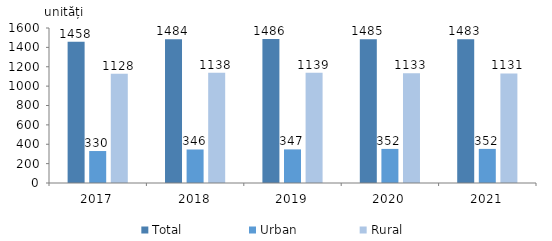
| Category | Total  | Urban | Rural |
|---|---|---|---|
| 2017.0 | 1458 | 330 | 1128 |
| 2018.0 | 1484 | 346 | 1138 |
| 2019.0 | 1486 | 347 | 1139 |
| 2020.0 | 1485 | 352 | 1133 |
| 2021.0 | 1483 | 352 | 1131 |